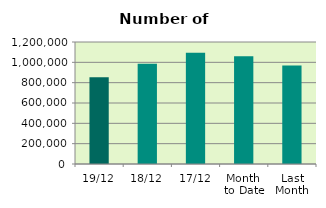
| Category | Series 0 |
|---|---|
| 19/12 | 853516 |
| 18/12 | 985396 |
| 17/12 | 1095026 |
| Month 
to Date | 1058898 |
| Last
Month | 969317.238 |